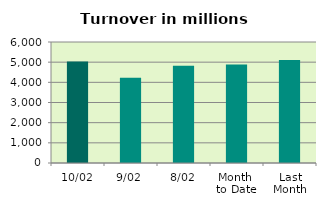
| Category | Series 0 |
|---|---|
| 10/02 | 5031.122 |
| 9/02 | 4227.49 |
| 8/02 | 4825.173 |
| Month 
to Date | 4889.033 |
| Last
Month | 5105.691 |